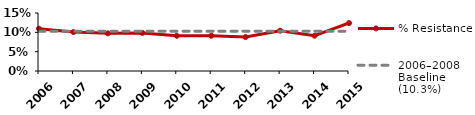
| Category | % Resistance | 2006–2008 Baseline (10.3%) |
|---|---|---|
| 2006.0 | 0.109 | 0.103 |
| 2007.0 | 0.101 | 0.103 |
| 2008.0 | 0.097 | 0.103 |
| 2009.0 | 0.099 | 0.103 |
| 2010.0 | 0.091 | 0.103 |
| 2011.0 | 0.091 | 0.103 |
| 2012.0 | 0.088 | 0.103 |
| 2013.0 | 0.104 | 0.103 |
| 2014.0 | 0.091 | 0.103 |
| 2015.0 | 0.124 | 0.103 |